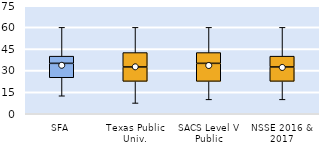
| Category | 25th | 50th | 75th |
|---|---|---|---|
| SFA | 25 | 10 | 5 |
| Texas Public Univ. | 22.5 | 10 | 10 |
| SACS Level V Public | 22.5 | 12.5 | 7.5 |
| NSSE 2016 & 2017 | 22.5 | 10 | 7.5 |